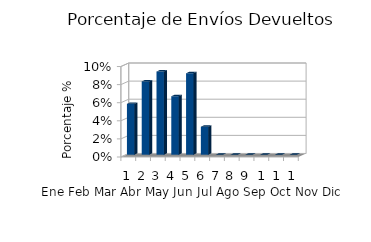
| Category | Series 0 |
|---|---|
| 0 | 0.056 |
| 1 | 0.081 |
| 2 | 0.092 |
| 3 | 0.065 |
| 4 | 0.09 |
| 5 | 0.031 |
| 6 | 0 |
| 7 | 0 |
| 8 | 0 |
| 9 | 0 |
| 10 | 0 |
| 11 | 0 |